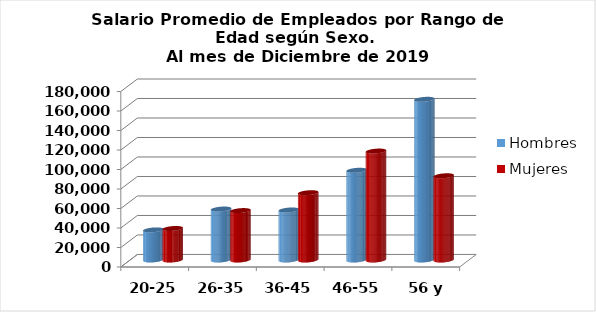
| Category | Hombres | Mujeres |
|---|---|---|
| 20-25 | 30890.25 | 32333.412 |
| 26-35 | 52265.339 | 50682.224 |
| 36-45 | 51307.771 | 69010.7 |
| 46-55 | 92044.706 | 111742.2 |
| 56 y más | 164837.524 | 86375.633 |